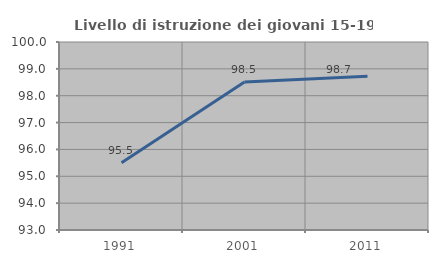
| Category | Livello di istruzione dei giovani 15-19 anni |
|---|---|
| 1991.0 | 95.5 |
| 2001.0 | 98.507 |
| 2011.0 | 98.729 |